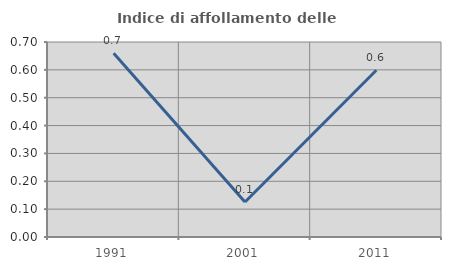
| Category | Indice di affollamento delle abitazioni  |
|---|---|
| 1991.0 | 0.66 |
| 2001.0 | 0.126 |
| 2011.0 | 0.599 |